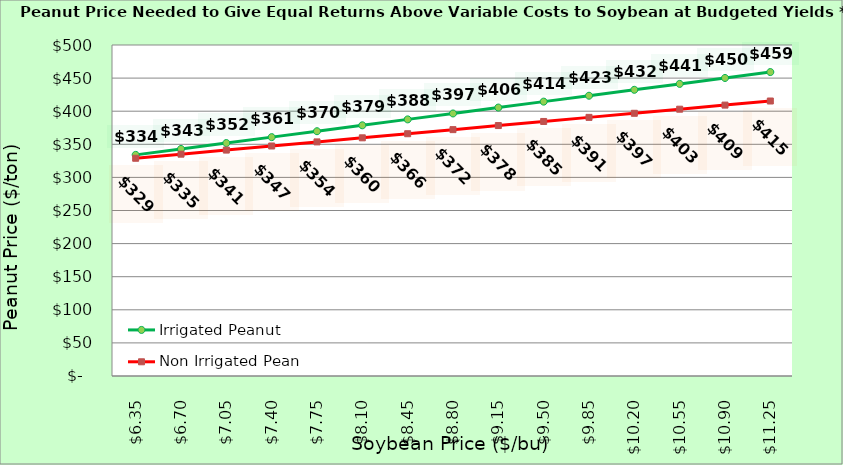
| Category | Irrigated Peanut | Non Irrigated Peanut |
|---|---|---|
| 6.350000000000003 | 334.02 | 328.914 |
| 6.700000000000003 | 342.956 | 335.09 |
| 7.0500000000000025 | 351.892 | 341.267 |
| 7.400000000000002 | 360.828 | 347.443 |
| 7.750000000000002 | 369.764 | 353.62 |
| 8.100000000000001 | 378.7 | 359.796 |
| 8.450000000000001 | 387.637 | 365.973 |
| 8.8 | 396.573 | 372.149 |
| 9.15 | 405.509 | 378.326 |
| 9.5 | 414.445 | 384.502 |
| 9.85 | 423.381 | 390.679 |
| 10.2 | 432.317 | 396.855 |
| 10.549999999999999 | 441.254 | 403.032 |
| 10.899999999999999 | 450.19 | 409.208 |
| 11.249999999999998 | 459.126 | 415.384 |